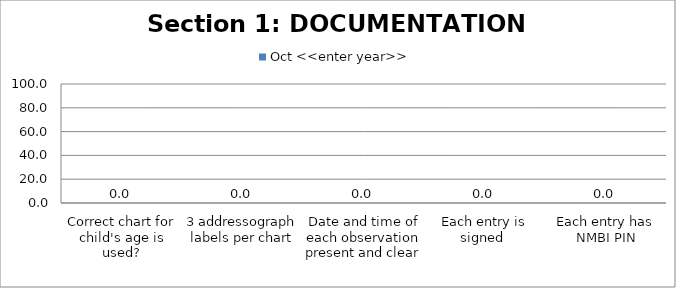
| Category | Oct <<enter year>> |
|---|---|
| Correct chart for child's age is used? | 0 |
| 3 addressograph labels per chart | 0 |
| Date and time of each observation present and clear  | 0 |
| Each entry is signed  | 0 |
| Each entry has NMBI PIN | 0 |